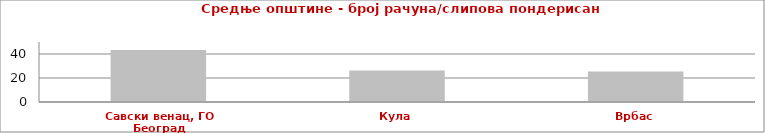
| Category | Series 0 |
|---|---|
| Савски венац, ГО Београд | 43.338 |
| Кула | 26.21 |
| Врбас | 25.429 |